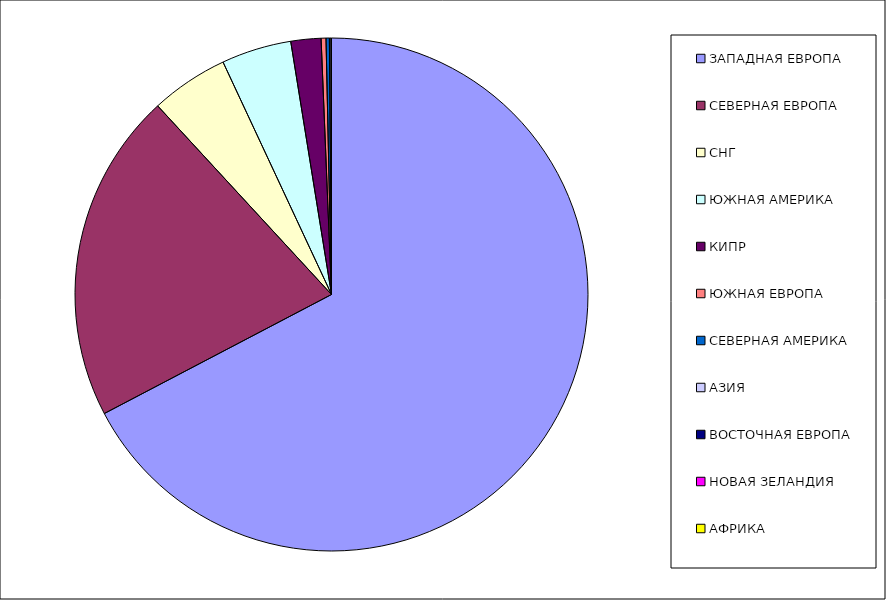
| Category | Оборот |
|---|---|
| ЗАПАДНАЯ ЕВРОПА | 0.673 |
| СЕВЕРНАЯ ЕВРОПА | 0.208 |
| СНГ | 0.049 |
| ЮЖНАЯ АМЕРИКА | 0.044 |
| КИПР | 0.019 |
| ЮЖНАЯ ЕВРОПА | 0.003 |
| СЕВЕРНАЯ АМЕРИКА | 0.002 |
| АЗИЯ | 0.001 |
| ВОСТОЧНАЯ ЕВРОПА | 0 |
| НОВАЯ ЗЕЛАНДИЯ | 0 |
| АФРИКА | 0 |